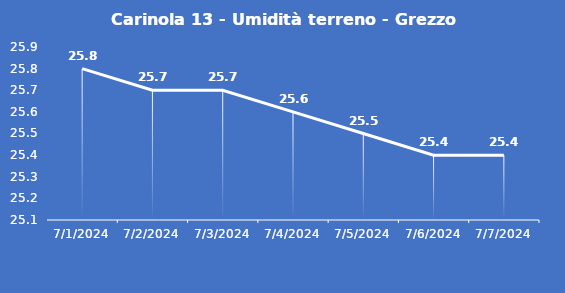
| Category | Carinola 13 - Umidità terreno - Grezzo (%VWC) |
|---|---|
| 7/1/24 | 25.8 |
| 7/2/24 | 25.7 |
| 7/3/24 | 25.7 |
| 7/4/24 | 25.6 |
| 7/5/24 | 25.5 |
| 7/6/24 | 25.4 |
| 7/7/24 | 25.4 |